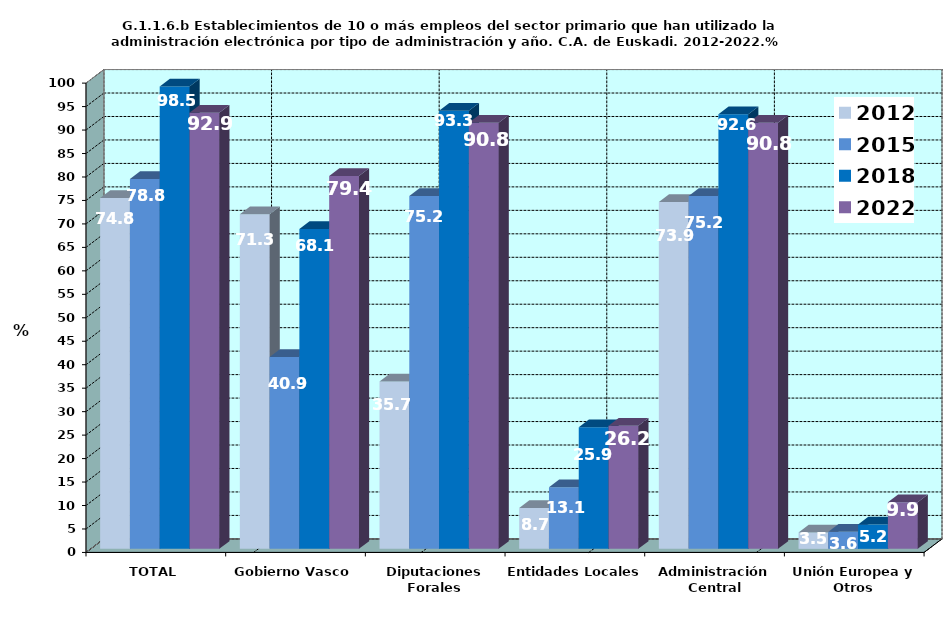
| Category | 2012 | 2015 | 2018 | 2022 |
|---|---|---|---|---|
| TOTAL | 74.783 | 78.832 | 98.519 | 92.908 |
| Gobierno Vasco | 71.304 | 40.876 | 68.148 | 79.433 |
| Diputaciones Forales | 35.652 | 75.182 | 93.333 | 90.78 |
| Entidades Locales | 8.696 | 13.139 | 25.926 | 26.241 |
| Administración Central | 73.913 | 75.182 | 92.593 | 90.78 |
| Unión Europea y Otros | 3.478 | 3.65 | 5.185 | 9.929 |